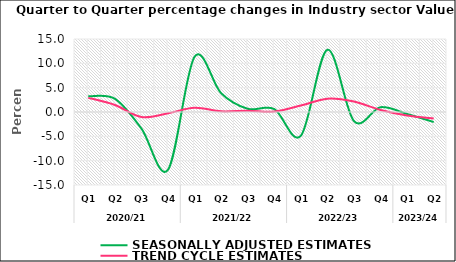
| Category | SEASONALLY ADJUSTED ESTIMATES | TREND CYCLE ESTIMATES |
|---|---|---|
| 0 | 3.219 | 2.907 |
| 1 | 2.716 | 1.448 |
| 2 | -3.403 | -1.035 |
| 3 | -11.877 | -0.276 |
| 4 | 11.352 | 0.874 |
| 5 | 3.86 | 0.148 |
| 6 | 0.657 | 0.274 |
| 7 | 0.602 | 0.099 |
| 8 | -4.882 | 1.328 |
| 9 | 12.798 | 2.728 |
| 10 | -1.874 | 2.137 |
| 11 | 0.984 | 0.428 |
| 12 | -0.411 | -0.712 |
| 13 | -2.061 | -1.34 |